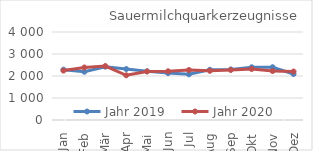
| Category | Jahr 2019 | Jahr 2020 |
|---|---|---|
| Jan | 2288.105 | 2245.698 |
| Feb | 2193.391 | 2387.271 |
| Mär | 2424.089 | 2450.832 |
| Apr | 2315.987 | 2032.168 |
| Mai | 2214.289 | 2206.077 |
| Jun | 2131.383 | 2214.729 |
| Jul | 2076.007 | 2273.099 |
| Aug | 2283.001 | 2235.371 |
| Sep | 2299.382 | 2275.003 |
| Okt | 2397.085 | 2318.052 |
| Nov | 2398.913 | 2226.457 |
| Dez | 2091.059 | 2204.384 |